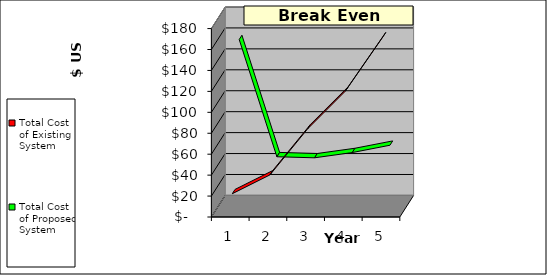
| Category | Total Cost of Existing System | Total Cost of Proposed System |
|---|---|---|
| 0 | 18 | 155 |
| 1 | 36 | 43 |
| 2 | 80 | 42 |
| 3 | 116 | 47 |
| 4 | 168 | 54 |